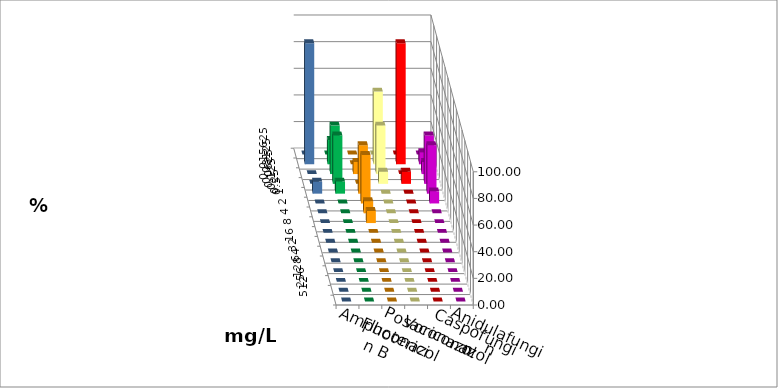
| Category | Amphotericin B | Fluconazol | Posaconazol | Voriconazol | Caspofungin | Anidulafungin |
|---|---|---|---|---|---|---|
| 0.015625 | 0 | 0 | 0 | 0 | 0 | 0 |
| 0.03125 | 18.182 | 0 | 54.545 | 90.909 | 9.091 | 90.909 |
| 0.0625 | 36.364 | 9.091 | 36.364 | 0 | 9.091 | 0 |
| 0.125 | 36.364 | 0 | 9.091 | 9.091 | 36.364 | 0 |
| 0.25 | 9.091 | 36.364 | 0 | 0 | 36.364 | 9.091 |
| 0.5 | 0 | 36.364 | 0 | 0 | 9.091 | 0 |
| 1.0 | 0 | 9.091 | 0 | 0 | 0 | 0 |
| 2.0 | 0 | 9.091 | 0 | 0 | 0 | 0 |
| 4.0 | 0 | 0 | 0 | 0 | 0 | 0 |
| 8.0 | 0 | 0 | 0 | 0 | 0 | 0 |
| 16.0 | 0 | 0 | 0 | 0 | 0 | 0 |
| 32.0 | 0 | 0 | 0 | 0 | 0 | 0 |
| 64.0 | 0 | 0 | 0 | 0 | 0 | 0 |
| 128.0 | 0 | 0 | 0 | 0 | 0 | 0 |
| 256.0 | 0 | 0 | 0 | 0 | 0 | 0 |
| 512.0 | 0 | 0 | 0 | 0 | 0 | 0 |